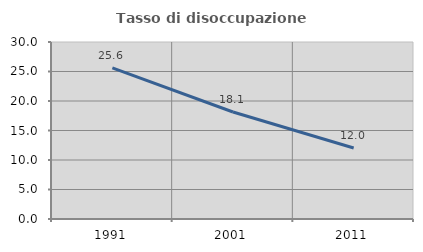
| Category | Tasso di disoccupazione giovanile  |
|---|---|
| 1991.0 | 25.606 |
| 2001.0 | 18.137 |
| 2011.0 | 12.03 |